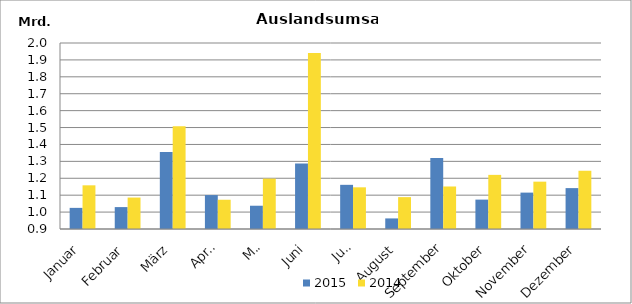
| Category | 2015 | 2014 |
|---|---|---|
| Januar | 1024949.909 | 1158317.127 |
| Februar | 1029537.053 | 1085972.821 |
| März | 1354951.174 | 1507265.089 |
| April | 1100619.211 | 1073000.198 |
| Mai | 1037629.582 | 1198071.116 |
| Juni | 1287933.915 | 1940435.713 |
| Juli | 1161234.743 | 1146472.523 |
| August | 962592.301 | 1088469.677 |
| September | 1320303.346 | 1151441.048 |
| Oktober | 1073797.357 | 1220101.074 |
| November | 1115210.446 | 1179996.753 |
| Dezember | 1141821.956 | 1244394.142 |